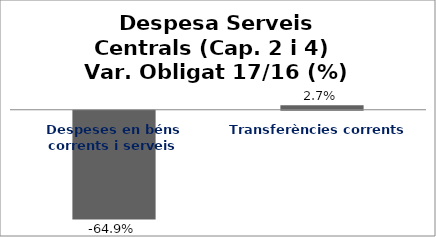
| Category | Series 0 |
|---|---|
| Despeses en béns corrents i serveis | -0.649 |
| Transferències corrents | 0.027 |